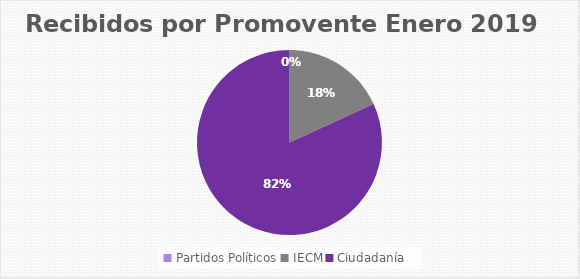
| Category | Recibidos por Promovente ENERO |
|---|---|
| Partidos Políticos | 0 |
| IECM | 2 |
| Ciudadanía  | 9 |